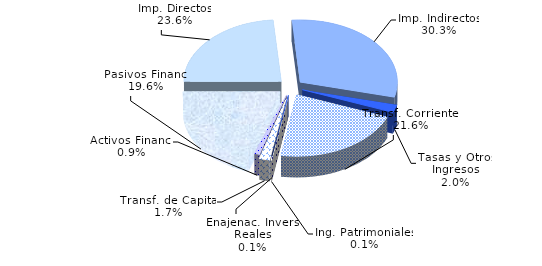
| Category | Series 0 |
|---|---|
| Imp. Directos | 23.646 |
| Imp. Indirectos | 30.274 |
| Tasas y Otros Ingresos | 2.033 |
| Transf. Corrientes | 21.61 |
| Ing. Patrimoniales | 0.076 |
| Enajenac. Invers. Reales | 0.076 |
| Transf. de Capital | 1.733 |
| Activos Financ. | 0.905 |
| Pasivos Financ. | 19.647 |